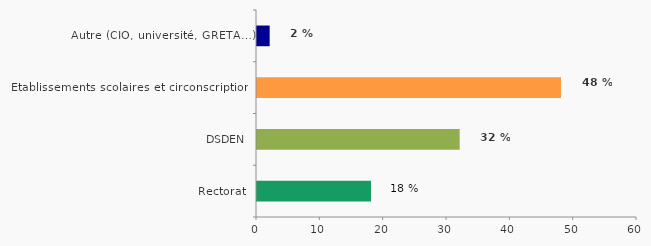
| Category | % |
|---|---|
| Rectorat | 18 |
| DSDEN | 32 |
| Etablissements scolaires et circonscriptions | 48 |
| Autre (CIO, université, GRETA…) | 2 |